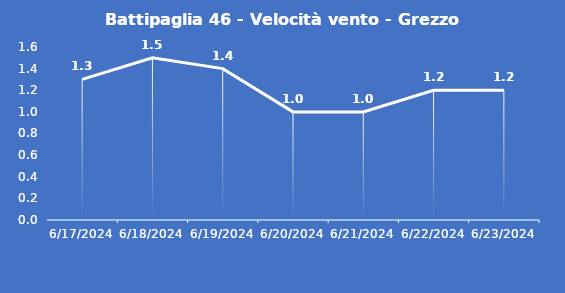
| Category | Battipaglia 46 - Velocità vento - Grezzo (m/s) |
|---|---|
| 6/17/24 | 1.3 |
| 6/18/24 | 1.5 |
| 6/19/24 | 1.4 |
| 6/20/24 | 1 |
| 6/21/24 | 1 |
| 6/22/24 | 1.2 |
| 6/23/24 | 1.2 |